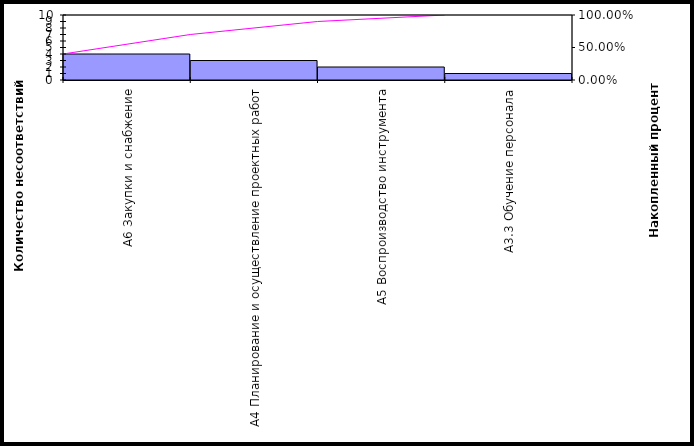
| Category | Series 1 |
|---|---|
| A6 Закупки и снабжение | 4 |
| A4 Планирование и осуществление проектных работ | 3 |
| A5 Воспроизводство инструмента | 2 |
| A3.3 Обучение персонала | 1 |